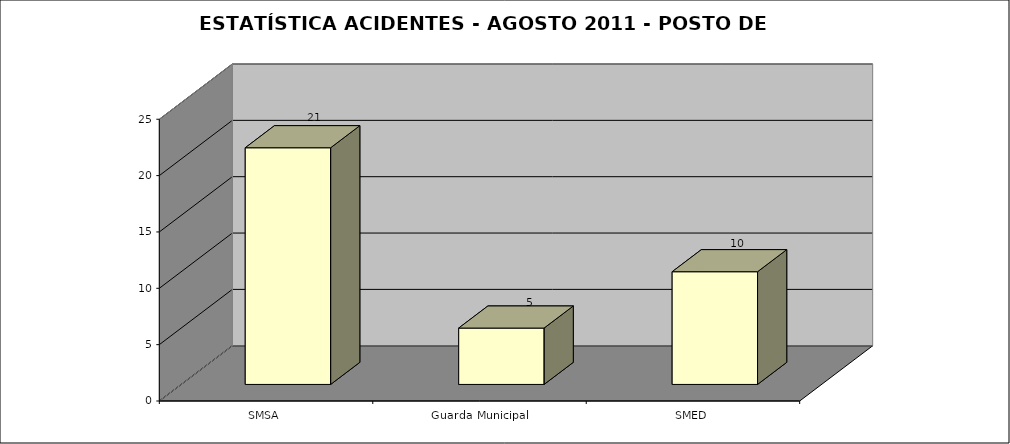
| Category | Series 0 |
|---|---|
| SMSA | 21 |
| Guarda Municipal | 5 |
| SMED | 10 |